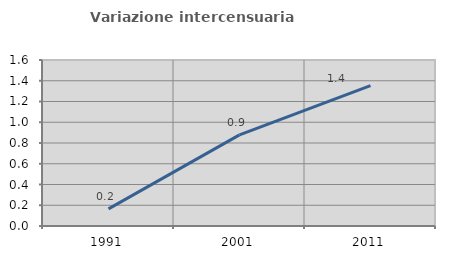
| Category | Variazione intercensuaria annua |
|---|---|
| 1991.0 | 0.165 |
| 2001.0 | 0.878 |
| 2011.0 | 1.352 |